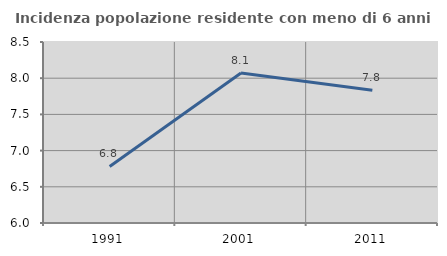
| Category | Incidenza popolazione residente con meno di 6 anni |
|---|---|
| 1991.0 | 6.782 |
| 2001.0 | 8.071 |
| 2011.0 | 7.832 |